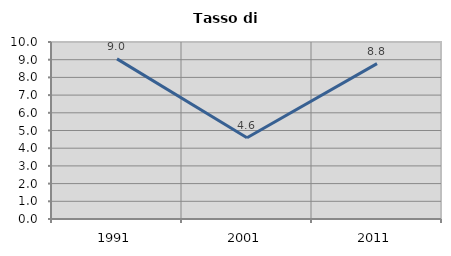
| Category | Tasso di disoccupazione   |
|---|---|
| 1991.0 | 9.045 |
| 2001.0 | 4.592 |
| 2011.0 | 8.779 |